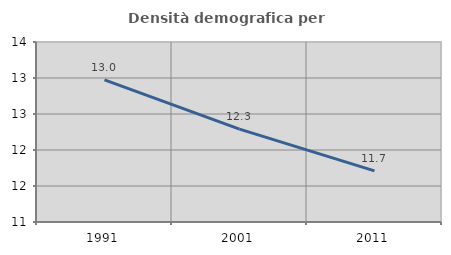
| Category | Densità demografica |
|---|---|
| 1991.0 | 12.973 |
| 2001.0 | 12.29 |
| 2011.0 | 11.71 |